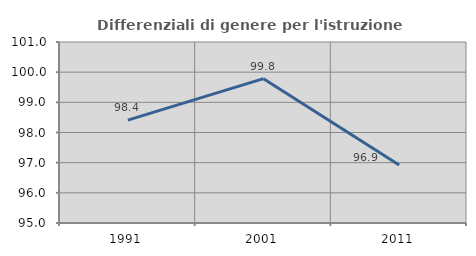
| Category | Differenziali di genere per l'istruzione superiore |
|---|---|
| 1991.0 | 98.411 |
| 2001.0 | 99.785 |
| 2011.0 | 96.926 |